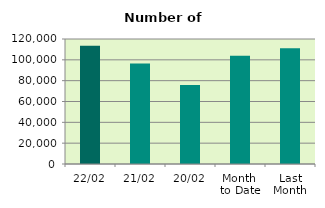
| Category | Series 0 |
|---|---|
| 22/02 | 113604 |
| 21/02 | 96500 |
| 20/02 | 75750 |
| Month 
to Date | 103820.125 |
| Last
Month | 111077.545 |